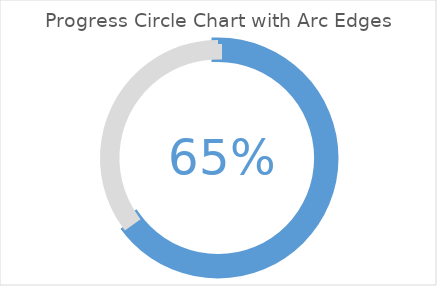
| Category | Series 0 |
|---|---|
| Completed | 0.65 |
| Remaining | 0.35 |